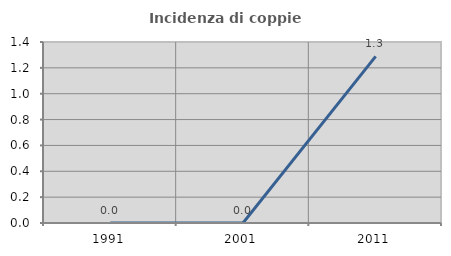
| Category | Incidenza di coppie miste |
|---|---|
| 1991.0 | 0 |
| 2001.0 | 0 |
| 2011.0 | 1.289 |